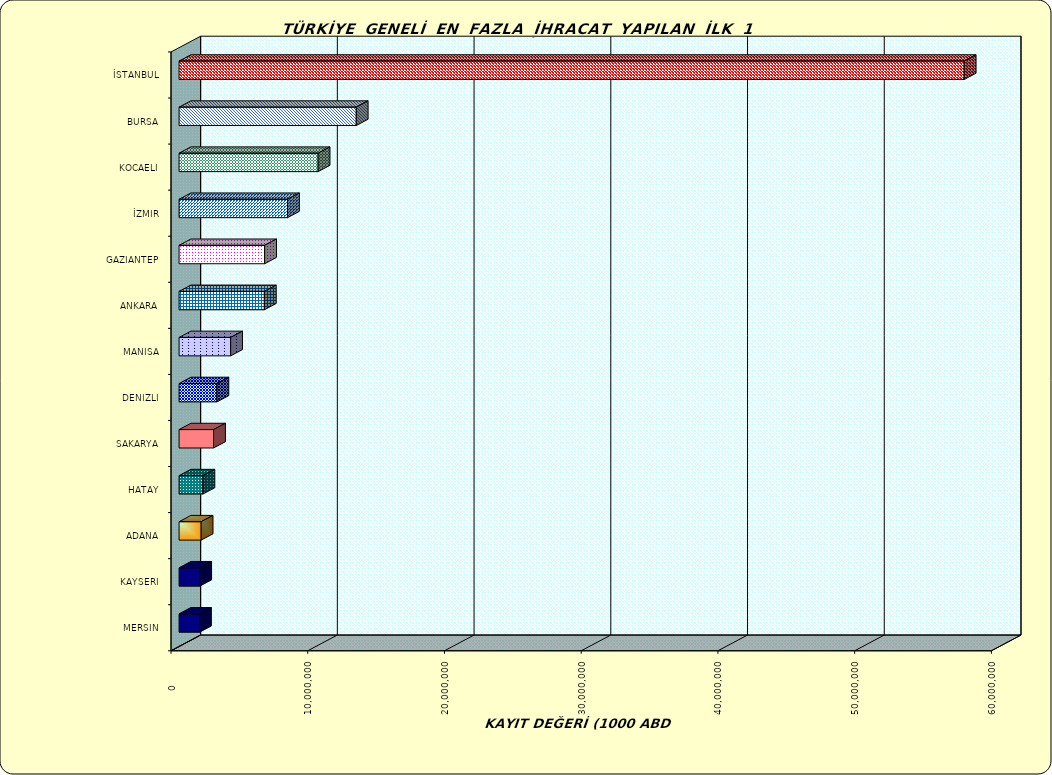
| Category | Series 0 |
|---|---|
| İSTANBUL | 57422796.438 |
| BURSA | 12959783.632 |
| KOCAELI | 10169827.393 |
| İZMIR | 7931457.189 |
| GAZIANTEP | 6258347.325 |
| ANKARA | 6237181.651 |
| MANISA | 3772155.01 |
| DENIZLI | 2766606.996 |
| SAKARYA | 2522839.781 |
| HATAY | 1745487.63 |
| ADANA | 1614949.652 |
| KAYSERI | 1509493.074 |
| MERSIN | 1494998.824 |